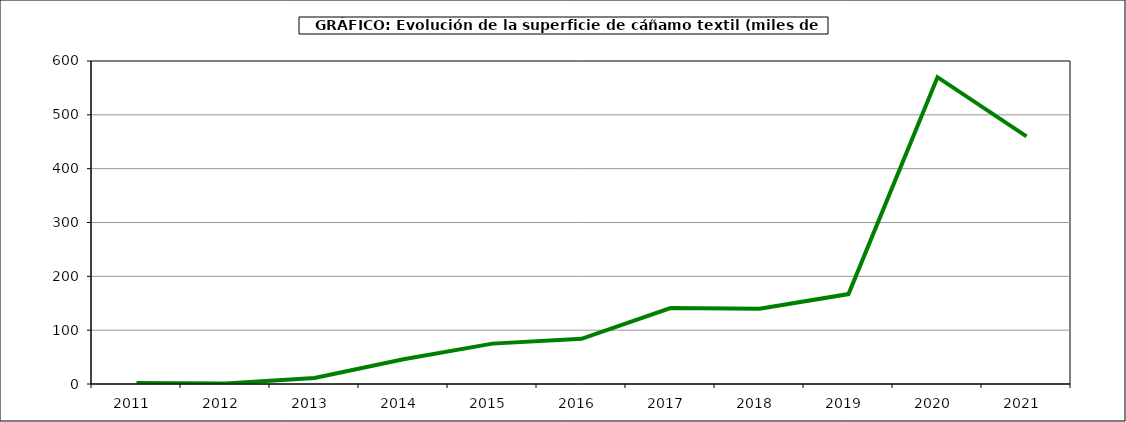
| Category | Superficie |
|---|---|
| 2011.0 | 2 |
| 2012.0 | 1 |
| 2013.0 | 11 |
| 2014.0 | 46 |
| 2015.0 | 75 |
| 2016.0 | 84 |
| 2017.0 | 141 |
| 2018.0 | 140 |
| 2019.0 | 167 |
| 2020.0 | 570 |
| 2021.0 | 460 |